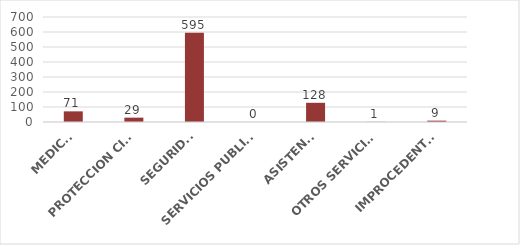
| Category | TOTAL |
|---|---|
| MEDICO | 71 |
| PROTECCION CIVIL | 29 |
| SEGURIDAD | 595 |
| SERVICIOS PUBLICOS | 0 |
| ASISTENCIA | 128 |
| OTROS SERVICIOS | 1 |
| IMPROCEDENTES | 9 |